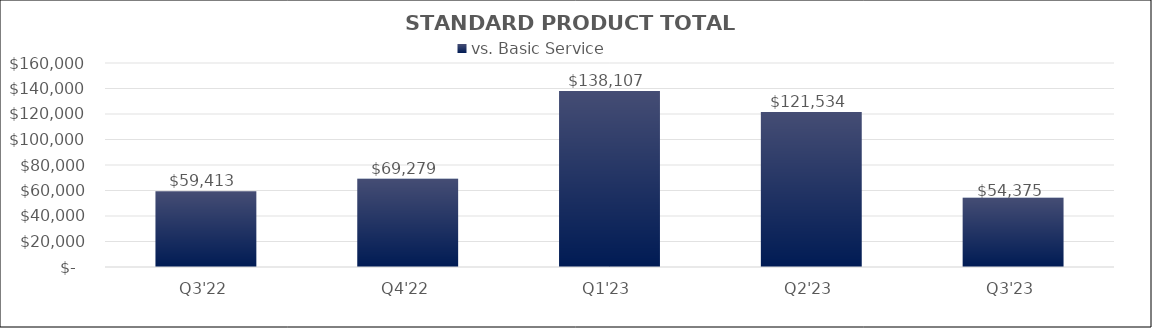
| Category | vs. Basic Service |
|---|---|
| Q3'22 | 59413.17 |
| Q4'22 | 69278.733 |
| Q1'23 | 138107.123 |
| Q2'23 | 121533.896 |
| Q3'23 | 54374.504 |